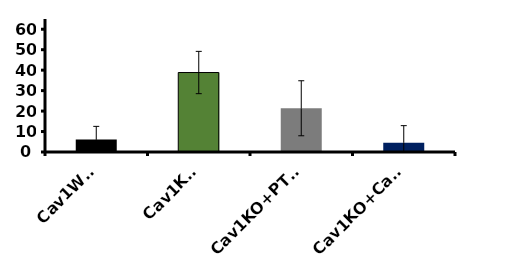
| Category | Series 0 |
|---|---|
| Cav1WT  | 6.11 |
| Cav1KO | 38.843 |
| Cav1KO+PTRF | 21.372 |
| Cav1KO+Cav1 | 4.523 |